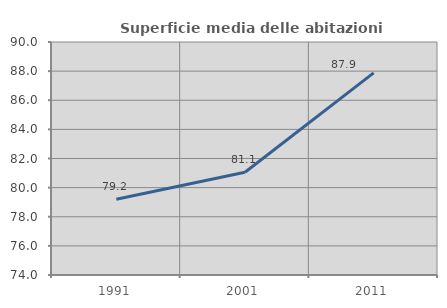
| Category | Superficie media delle abitazioni occupate |
|---|---|
| 1991.0 | 79.203 |
| 2001.0 | 81.059 |
| 2011.0 | 87.878 |